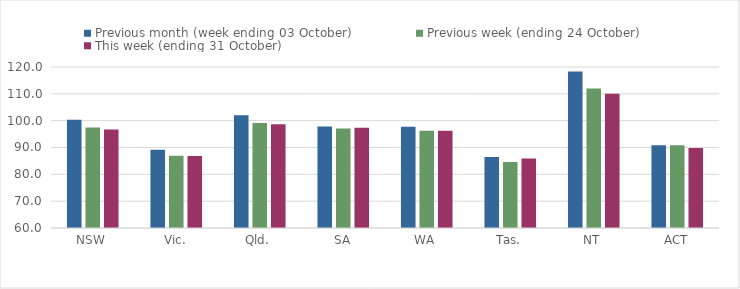
| Category | Previous month (week ending 03 October) | Previous week (ending 24 October) | This week (ending 31 October) |
|---|---|---|---|
| NSW | 100.33 | 97.48 | 96.72 |
| Vic. | 89.15 | 86.93 | 86.79 |
| Qld. | 102.01 | 99.13 | 98.64 |
| SA | 97.83 | 97.12 | 97.35 |
| WA | 97.72 | 96.28 | 96.28 |
| Tas. | 86.5 | 84.56 | 85.91 |
| NT | 118.32 | 111.96 | 110.05 |
| ACT | 90.83 | 90.83 | 89.83 |